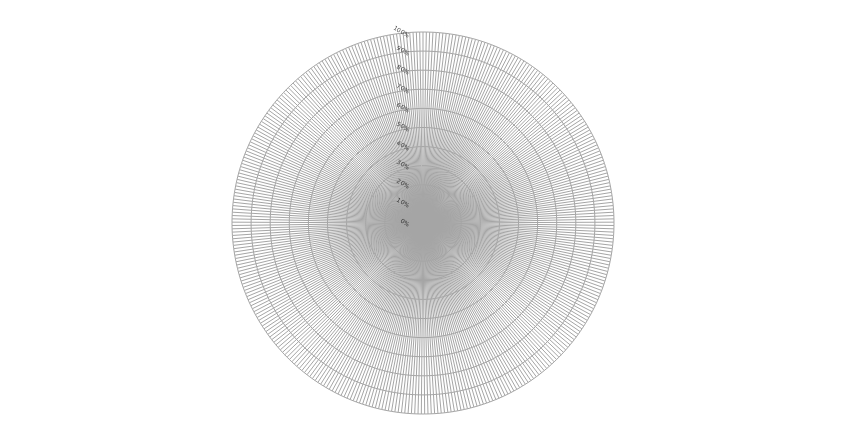
| Category | Kwaliteitsstandaard 1 | Kwaliteitsstandaard 2 | Kwaliteitsstandaard 3 | Kwaliteitsstandaard 4 | Kwaliteitsstandaard 5 | Kwaliteitsstandaard 6 | Kwaliteitsstandaard 7 | Kwaliteitsstandaard 8 | Kwaliteitsstandaard 9 | Kwaliteitsstandaard 10 |
|---|---|---|---|---|---|---|---|---|---|---|
| 0.0 | 0 | 0 | 0 | 0 | 0 | 0 | 0 | 0 | 0 | 0 |
| 1.0 | 0 | 0 | 0 | 0 | 0 | 0 | 0 | 0 | 0 | 0 |
| 2.0 | 0 | 0 | 0 | 0 | 0 | 0 | 0 | 0 | 0 | 0 |
| 3.0 | 0 | 0 | 0 | 0 | 0 | 0 | 0 | 0 | 0 | 0 |
| 4.0 | 0 | 0 | 0 | 0 | 0 | 0 | 0 | 0 | 0 | 0 |
| 5.0 | 0 | 0 | 0 | 0 | 0 | 0 | 0 | 0 | 0 | 0 |
| 6.0 | 0 | 0 | 0 | 0 | 0 | 0 | 0 | 0 | 0 | 0 |
| 7.0 | 0 | 0 | 0 | 0 | 0 | 0 | 0 | 0 | 0 | 0 |
| 8.0 | 0 | 0 | 0 | 0 | 0 | 0 | 0 | 0 | 0 | 0 |
| 9.0 | 0 | 0 | 0 | 0 | 0 | 0 | 0 | 0 | 0 | 0 |
| 10.0 | 0 | 0 | 0 | 0 | 0 | 0 | 0 | 0 | 0 | 0 |
| 11.0 | 0 | 0 | 0 | 0 | 0 | 0 | 0 | 0 | 0 | 0 |
| 12.0 | 0 | 0 | 0 | 0 | 0 | 0 | 0 | 0 | 0 | 0 |
| 13.0 | 0 | 0 | 0 | 0 | 0 | 0 | 0 | 0 | 0 | 0 |
| 14.0 | 0 | 0 | 0 | 0 | 0 | 0 | 0 | 0 | 0 | 0 |
| 15.0 | 0 | 0 | 0 | 0 | 0 | 0 | 0 | 0 | 0 | 0 |
| 16.0 | 0 | 0 | 0 | 0 | 0 | 0 | 0 | 0 | 0 | 0 |
| 17.0 | 0 | 0 | 0 | 0 | 0 | 0 | 0 | 0 | 0 | 0 |
| 18.0 | 0 | 0 | 0 | 0 | 0 | 0 | 0 | 0 | 0 | 0 |
| 19.0 | 0 | 0 | 0 | 0 | 0 | 0 | 0 | 0 | 0 | 0 |
| 20.0 | 0 | 0 | 0 | 0 | 0 | 0 | 0 | 0 | 0 | 0 |
| 21.0 | 0 | 0 | 0 | 0 | 0 | 0 | 0 | 0 | 0 | 0 |
| 22.0 | 0 | 0 | 0 | 0 | 0 | 0 | 0 | 0 | 0 | 0 |
| 23.0 | 0 | 0 | 0 | 0 | 0 | 0 | 0 | 0 | 0 | 0 |
| 24.0 | 0 | 0 | 0 | 0 | 0 | 0 | 0 | 0 | 0 | 0 |
| 25.0 | 0 | 0 | 0 | 0 | 0 | 0 | 0 | 0 | 0 | 0 |
| 26.0 | 0 | 0 | 0 | 0 | 0 | 0 | 0 | 0 | 0 | 0 |
| 27.0 | 0 | 0 | 0 | 0 | 0 | 0 | 0 | 0 | 0 | 0 |
| 28.0 | 0 | 0 | 0 | 0 | 0 | 0 | 0 | 0 | 0 | 0 |
| 29.0 | 0 | 0 | 0 | 0 | 0 | 0 | 0 | 0 | 0 | 0 |
| 30.0 | 0 | 0 | 0 | 0 | 0 | 0 | 0 | 0 | 0 | 0 |
| 31.0 | 0 | 0 | 0 | 0 | 0 | 0 | 0 | 0 | 0 | 0 |
| 32.0 | 0 | 0 | 0 | 0 | 0 | 0 | 0 | 0 | 0 | 0 |
| 33.0 | 0 | 0 | 0 | 0 | 0 | 0 | 0 | 0 | 0 | 0 |
| 34.0 | 0 | 0 | 0 | 0 | 0 | 0 | 0 | 0 | 0 | 0 |
| 35.0 | 0 | 0 | 0 | 0 | 0 | 0 | 0 | 0 | 0 | 0 |
| 36.0 | 0 | 0 | 0 | 0 | 0 | 0 | 0 | 0 | 0 | 0 |
| 37.0 | 0 | 0 | 0 | 0 | 0 | 0 | 0 | 0 | 0 | 0 |
| 38.0 | 0 | 0 | 0 | 0 | 0 | 0 | 0 | 0 | 0 | 0 |
| 39.0 | 0 | 0 | 0 | 0 | 0 | 0 | 0 | 0 | 0 | 0 |
| 40.0 | 0 | 0 | 0 | 0 | 0 | 0 | 0 | 0 | 0 | 0 |
| 41.0 | 0 | 0 | 0 | 0 | 0 | 0 | 0 | 0 | 0 | 0 |
| 42.0 | 0 | 0 | 0 | 0 | 0 | 0 | 0 | 0 | 0 | 0 |
| 43.0 | 0 | 0 | 0 | 0 | 0 | 0 | 0 | 0 | 0 | 0 |
| 44.0 | 0 | 0 | 0 | 0 | 0 | 0 | 0 | 0 | 0 | 0 |
| 45.0 | 0 | 0 | 0 | 0 | 0 | 0 | 0 | 0 | 0 | 0 |
| 46.0 | 0 | 0 | 0 | 0 | 0 | 0 | 0 | 0 | 0 | 0 |
| 47.0 | 0 | 0 | 0 | 0 | 0 | 0 | 0 | 0 | 0 | 0 |
| 48.0 | 0 | 0 | 0 | 0 | 0 | 0 | 0 | 0 | 0 | 0 |
| 49.0 | 0 | 0 | 0 | 0 | 0 | 0 | 0 | 0 | 0 | 0 |
| 50.0 | 0 | 0 | 0 | 0 | 0 | 0 | 0 | 0 | 0 | 0 |
| 51.0 | 0 | 0 | 0 | 0 | 0 | 0 | 0 | 0 | 0 | 0 |
| 52.0 | 0 | 0 | 0 | 0 | 0 | 0 | 0 | 0 | 0 | 0 |
| 53.0 | 0 | 0 | 0 | 0 | 0 | 0 | 0 | 0 | 0 | 0 |
| 54.0 | 0 | 0 | 0 | 0 | 0 | 0 | 0 | 0 | 0 | 0 |
| 55.0 | 0 | 0 | 0 | 0 | 0 | 0 | 0 | 0 | 0 | 0 |
| 56.0 | 0 | 0 | 0 | 0 | 0 | 0 | 0 | 0 | 0 | 0 |
| 57.0 | 0 | 0 | 0 | 0 | 0 | 0 | 0 | 0 | 0 | 0 |
| 58.0 | 0 | 0 | 0 | 0 | 0 | 0 | 0 | 0 | 0 | 0 |
| 59.0 | 0 | 0 | 0 | 0 | 0 | 0 | 0 | 0 | 0 | 0 |
| 60.0 | 0 | 0 | 0 | 0 | 0 | 0 | 0 | 0 | 0 | 0 |
| 61.0 | 0 | 0 | 0 | 0 | 0 | 0 | 0 | 0 | 0 | 0 |
| 62.0 | 0 | 0 | 0 | 0 | 0 | 0 | 0 | 0 | 0 | 0 |
| 63.0 | 0 | 0 | 0 | 0 | 0 | 0 | 0 | 0 | 0 | 0 |
| 64.0 | 0 | 0 | 0 | 0 | 0 | 0 | 0 | 0 | 0 | 0 |
| 65.0 | 0 | 0 | 0 | 0 | 0 | 0 | 0 | 0 | 0 | 0 |
| 66.0 | 0 | 0 | 0 | 0 | 0 | 0 | 0 | 0 | 0 | 0 |
| 67.0 | 0 | 0 | 0 | 0 | 0 | 0 | 0 | 0 | 0 | 0 |
| 68.0 | 0 | 0 | 0 | 0 | 0 | 0 | 0 | 0 | 0 | 0 |
| 69.0 | 0 | 0 | 0 | 0 | 0 | 0 | 0 | 0 | 0 | 0 |
| 70.0 | 0 | 0 | 0 | 0 | 0 | 0 | 0 | 0 | 0 | 0 |
| 71.0 | 0 | 0 | 0 | 0 | 0 | 0 | 0 | 0 | 0 | 0 |
| 72.0 | 0 | 0 | 0 | 0 | 0 | 0 | 0 | 0 | 0 | 0 |
| 73.0 | 0 | 0 | 0 | 0 | 0 | 0 | 0 | 0 | 0 | 0 |
| 74.0 | 0 | 0 | 0 | 0 | 0 | 0 | 0 | 0 | 0 | 0 |
| 75.0 | 0 | 0 | 0 | 0 | 0 | 0 | 0 | 0 | 0 | 0 |
| 76.0 | 0 | 0 | 0 | 0 | 0 | 0 | 0 | 0 | 0 | 0 |
| 77.0 | 0 | 0 | 0 | 0 | 0 | 0 | 0 | 0 | 0 | 0 |
| 78.0 | 0 | 0 | 0 | 0 | 0 | 0 | 0 | 0 | 0 | 0 |
| 79.0 | 0 | 0 | 0 | 0 | 0 | 0 | 0 | 0 | 0 | 0 |
| 80.0 | 0 | 0 | 0 | 0 | 0 | 0 | 0 | 0 | 0 | 0 |
| 81.0 | 0 | 0 | 0 | 0 | 0 | 0 | 0 | 0 | 0 | 0 |
| 82.0 | 0 | 0 | 0 | 0 | 0 | 0 | 0 | 0 | 0 | 0 |
| 83.0 | 0 | 0 | 0 | 0 | 0 | 0 | 0 | 0 | 0 | 0 |
| 84.0 | 0 | 0 | 0 | 0 | 0 | 0 | 0 | 0 | 0 | 0 |
| 85.0 | 0 | 0 | 0 | 0 | 0 | 0 | 0 | 0 | 0 | 0 |
| 86.0 | 0 | 0 | 0 | 0 | 0 | 0 | 0 | 0 | 0 | 0 |
| 87.0 | 0 | 0 | 0 | 0 | 0 | 0 | 0 | 0 | 0 | 0 |
| 88.0 | 0 | 0 | 0 | 0 | 0 | 0 | 0 | 0 | 0 | 0 |
| 89.0 | 0 | 0 | 0 | 0 | 0 | 0 | 0 | 0 | 0 | 0 |
| 90.0 | 0 | 0 | 0 | 0 | 0 | 0 | 0 | 0 | 0 | 0 |
| 91.0 | 0 | 0 | 0 | 0 | 0 | 0 | 0 | 0 | 0 | 0 |
| 92.0 | 0 | 0 | 0 | 0 | 0 | 0 | 0 | 0 | 0 | 0 |
| 93.0 | 0 | 0 | 0 | 0 | 0 | 0 | 0 | 0 | 0 | 0 |
| 94.0 | 0 | 0 | 0 | 0 | 0 | 0 | 0 | 0 | 0 | 0 |
| 95.0 | 0 | 0 | 0 | 0 | 0 | 0 | 0 | 0 | 0 | 0 |
| 96.0 | 0 | 0 | 0 | 0 | 0 | 0 | 0 | 0 | 0 | 0 |
| 97.0 | 0 | 0 | 0 | 0 | 0 | 0 | 0 | 0 | 0 | 0 |
| 98.0 | 0 | 0 | 0 | 0 | 0 | 0 | 0 | 0 | 0 | 0 |
| 99.0 | 0 | 0 | 0 | 0 | 0 | 0 | 0 | 0 | 0 | 0 |
| 100.0 | 0 | 0 | 0 | 0 | 0 | 0 | 0 | 0 | 0 | 0 |
| 101.0 | 0 | 0 | 0 | 0 | 0 | 0 | 0 | 0 | 0 | 0 |
| 102.0 | 0 | 0 | 0 | 0 | 0 | 0 | 0 | 0 | 0 | 0 |
| 103.0 | 0 | 0 | 0 | 0 | 0 | 0 | 0 | 0 | 0 | 0 |
| 104.0 | 0 | 0 | 0 | 0 | 0 | 0 | 0 | 0 | 0 | 0 |
| 105.0 | 0 | 0 | 0 | 0 | 0 | 0 | 0 | 0 | 0 | 0 |
| 106.0 | 0 | 0 | 0 | 0 | 0 | 0 | 0 | 0 | 0 | 0 |
| 107.0 | 0 | 0 | 0 | 0 | 0 | 0 | 0 | 0 | 0 | 0 |
| 108.0 | 0 | 0 | 0 | 0 | 0 | 0 | 0 | 0 | 0 | 0 |
| 109.0 | 0 | 0 | 0 | 0 | 0 | 0 | 0 | 0 | 0 | 0 |
| 110.0 | 0 | 0 | 0 | 0 | 0 | 0 | 0 | 0 | 0 | 0 |
| 111.0 | 0 | 0 | 0 | 0 | 0 | 0 | 0 | 0 | 0 | 0 |
| 112.0 | 0 | 0 | 0 | 0 | 0 | 0 | 0 | 0 | 0 | 0 |
| 113.0 | 0 | 0 | 0 | 0 | 0 | 0 | 0 | 0 | 0 | 0 |
| 114.0 | 0 | 0 | 0 | 0 | 0 | 0 | 0 | 0 | 0 | 0 |
| 115.0 | 0 | 0 | 0 | 0 | 0 | 0 | 0 | 0 | 0 | 0 |
| 116.0 | 0 | 0 | 0 | 0 | 0 | 0 | 0 | 0 | 0 | 0 |
| 117.0 | 0 | 0 | 0 | 0 | 0 | 0 | 0 | 0 | 0 | 0 |
| 118.0 | 0 | 0 | 0 | 0 | 0 | 0 | 0 | 0 | 0 | 0 |
| 119.0 | 0 | 0 | 0 | 0 | 0 | 0 | 0 | 0 | 0 | 0 |
| 120.0 | 0 | 0 | 0 | 0 | 0 | 0 | 0 | 0 | 0 | 0 |
| 121.0 | 0 | 0 | 0 | 0 | 0 | 0 | 0 | 0 | 0 | 0 |
| 122.0 | 0 | 0 | 0 | 0 | 0 | 0 | 0 | 0 | 0 | 0 |
| 123.0 | 0 | 0 | 0 | 0 | 0 | 0 | 0 | 0 | 0 | 0 |
| 124.0 | 0 | 0 | 0 | 0 | 0 | 0 | 0 | 0 | 0 | 0 |
| 125.0 | 0 | 0 | 0 | 0 | 0 | 0 | 0 | 0 | 0 | 0 |
| 126.0 | 0 | 0 | 0 | 0 | 0 | 0 | 0 | 0 | 0 | 0 |
| 127.0 | 0 | 0 | 0 | 0 | 0 | 0 | 0 | 0 | 0 | 0 |
| 128.0 | 0 | 0 | 0 | 0 | 0 | 0 | 0 | 0 | 0 | 0 |
| 129.0 | 0 | 0 | 0 | 0 | 0 | 0 | 0 | 0 | 0 | 0 |
| 130.0 | 0 | 0 | 0 | 0 | 0 | 0 | 0 | 0 | 0 | 0 |
| 131.0 | 0 | 0 | 0 | 0 | 0 | 0 | 0 | 0 | 0 | 0 |
| 132.0 | 0 | 0 | 0 | 0 | 0 | 0 | 0 | 0 | 0 | 0 |
| 133.0 | 0 | 0 | 0 | 0 | 0 | 0 | 0 | 0 | 0 | 0 |
| 134.0 | 0 | 0 | 0 | 0 | 0 | 0 | 0 | 0 | 0 | 0 |
| 135.0 | 0 | 0 | 0 | 0 | 0 | 0 | 0 | 0 | 0 | 0 |
| 136.0 | 0 | 0 | 0 | 0 | 0 | 0 | 0 | 0 | 0 | 0 |
| 137.0 | 0 | 0 | 0 | 0 | 0 | 0 | 0 | 0 | 0 | 0 |
| 138.0 | 0 | 0 | 0 | 0 | 0 | 0 | 0 | 0 | 0 | 0 |
| 139.0 | 0 | 0 | 0 | 0 | 0 | 0 | 0 | 0 | 0 | 0 |
| 140.0 | 0 | 0 | 0 | 0 | 0 | 0 | 0 | 0 | 0 | 0 |
| 141.0 | 0 | 0 | 0 | 0 | 0 | 0 | 0 | 0 | 0 | 0 |
| 142.0 | 0 | 0 | 0 | 0 | 0 | 0 | 0 | 0 | 0 | 0 |
| 143.0 | 0 | 0 | 0 | 0 | 0 | 0 | 0 | 0 | 0 | 0 |
| 144.0 | 0 | 0 | 0 | 0 | 0 | 0 | 0 | 0 | 0 | 0 |
| 145.0 | 0 | 0 | 0 | 0 | 0 | 0 | 0 | 0 | 0 | 0 |
| 146.0 | 0 | 0 | 0 | 0 | 0 | 0 | 0 | 0 | 0 | 0 |
| 147.0 | 0 | 0 | 0 | 0 | 0 | 0 | 0 | 0 | 0 | 0 |
| 148.0 | 0 | 0 | 0 | 0 | 0 | 0 | 0 | 0 | 0 | 0 |
| 149.0 | 0 | 0 | 0 | 0 | 0 | 0 | 0 | 0 | 0 | 0 |
| 150.0 | 0 | 0 | 0 | 0 | 0 | 0 | 0 | 0 | 0 | 0 |
| 151.0 | 0 | 0 | 0 | 0 | 0 | 0 | 0 | 0 | 0 | 0 |
| 152.0 | 0 | 0 | 0 | 0 | 0 | 0 | 0 | 0 | 0 | 0 |
| 153.0 | 0 | 0 | 0 | 0 | 0 | 0 | 0 | 0 | 0 | 0 |
| 154.0 | 0 | 0 | 0 | 0 | 0 | 0 | 0 | 0 | 0 | 0 |
| 155.0 | 0 | 0 | 0 | 0 | 0 | 0 | 0 | 0 | 0 | 0 |
| 156.0 | 0 | 0 | 0 | 0 | 0 | 0 | 0 | 0 | 0 | 0 |
| 157.0 | 0 | 0 | 0 | 0 | 0 | 0 | 0 | 0 | 0 | 0 |
| 158.0 | 0 | 0 | 0 | 0 | 0 | 0 | 0 | 0 | 0 | 0 |
| 159.0 | 0 | 0 | 0 | 0 | 0 | 0 | 0 | 0 | 0 | 0 |
| 160.0 | 0 | 0 | 0 | 0 | 0 | 0 | 0 | 0 | 0 | 0 |
| 161.0 | 0 | 0 | 0 | 0 | 0 | 0 | 0 | 0 | 0 | 0 |
| 162.0 | 0 | 0 | 0 | 0 | 0 | 0 | 0 | 0 | 0 | 0 |
| 163.0 | 0 | 0 | 0 | 0 | 0 | 0 | 0 | 0 | 0 | 0 |
| 164.0 | 0 | 0 | 0 | 0 | 0 | 0 | 0 | 0 | 0 | 0 |
| 165.0 | 0 | 0 | 0 | 0 | 0 | 0 | 0 | 0 | 0 | 0 |
| 166.0 | 0 | 0 | 0 | 0 | 0 | 0 | 0 | 0 | 0 | 0 |
| 167.0 | 0 | 0 | 0 | 0 | 0 | 0 | 0 | 0 | 0 | 0 |
| 168.0 | 0 | 0 | 0 | 0 | 0 | 0 | 0 | 0 | 0 | 0 |
| 169.0 | 0 | 0 | 0 | 0 | 0 | 0 | 0 | 0 | 0 | 0 |
| 170.0 | 0 | 0 | 0 | 0 | 0 | 0 | 0 | 0 | 0 | 0 |
| 171.0 | 0 | 0 | 0 | 0 | 0 | 0 | 0 | 0 | 0 | 0 |
| 172.0 | 0 | 0 | 0 | 0 | 0 | 0 | 0 | 0 | 0 | 0 |
| 173.0 | 0 | 0 | 0 | 0 | 0 | 0 | 0 | 0 | 0 | 0 |
| 174.0 | 0 | 0 | 0 | 0 | 0 | 0 | 0 | 0 | 0 | 0 |
| 175.0 | 0 | 0 | 0 | 0 | 0 | 0 | 0 | 0 | 0 | 0 |
| 176.0 | 0 | 0 | 0 | 0 | 0 | 0 | 0 | 0 | 0 | 0 |
| 177.0 | 0 | 0 | 0 | 0 | 0 | 0 | 0 | 0 | 0 | 0 |
| 178.0 | 0 | 0 | 0 | 0 | 0 | 0 | 0 | 0 | 0 | 0 |
| 179.0 | 0 | 0 | 0 | 0 | 0 | 0 | 0 | 0 | 0 | 0 |
| 180.0 | 0 | 0 | 0 | 0 | 0 | 0 | 0 | 0 | 0 | 0 |
| 181.0 | 0 | 0 | 0 | 0 | 0 | 0 | 0 | 0 | 0 | 0 |
| 182.0 | 0 | 0 | 0 | 0 | 0 | 0 | 0 | 0 | 0 | 0 |
| 183.0 | 0 | 0 | 0 | 0 | 0 | 0 | 0 | 0 | 0 | 0 |
| 184.0 | 0 | 0 | 0 | 0 | 0 | 0 | 0 | 0 | 0 | 0 |
| 185.0 | 0 | 0 | 0 | 0 | 0 | 0 | 0 | 0 | 0 | 0 |
| 186.0 | 0 | 0 | 0 | 0 | 0 | 0 | 0 | 0 | 0 | 0 |
| 187.0 | 0 | 0 | 0 | 0 | 0 | 0 | 0 | 0 | 0 | 0 |
| 188.0 | 0 | 0 | 0 | 0 | 0 | 0 | 0 | 0 | 0 | 0 |
| 189.0 | 0 | 0 | 0 | 0 | 0 | 0 | 0 | 0 | 0 | 0 |
| 190.0 | 0 | 0 | 0 | 0 | 0 | 0 | 0 | 0 | 0 | 0 |
| 191.0 | 0 | 0 | 0 | 0 | 0 | 0 | 0 | 0 | 0 | 0 |
| 192.0 | 0 | 0 | 0 | 0 | 0 | 0 | 0 | 0 | 0 | 0 |
| 193.0 | 0 | 0 | 0 | 0 | 0 | 0 | 0 | 0 | 0 | 0 |
| 194.0 | 0 | 0 | 0 | 0 | 0 | 0 | 0 | 0 | 0 | 0 |
| 195.0 | 0 | 0 | 0 | 0 | 0 | 0 | 0 | 0 | 0 | 0 |
| 196.0 | 0 | 0 | 0 | 0 | 0 | 0 | 0 | 0 | 0 | 0 |
| 197.0 | 0 | 0 | 0 | 0 | 0 | 0 | 0 | 0 | 0 | 0 |
| 198.0 | 0 | 0 | 0 | 0 | 0 | 0 | 0 | 0 | 0 | 0 |
| 199.0 | 0 | 0 | 0 | 0 | 0 | 0 | 0 | 0 | 0 | 0 |
| 200.0 | 0 | 0 | 0 | 0 | 0 | 0 | 0 | 0 | 0 | 0 |
| 201.0 | 0 | 0 | 0 | 0 | 0 | 0 | 0 | 0 | 0 | 0 |
| 202.0 | 0 | 0 | 0 | 0 | 0 | 0 | 0 | 0 | 0 | 0 |
| 203.0 | 0 | 0 | 0 | 0 | 0 | 0 | 0 | 0 | 0 | 0 |
| 204.0 | 0 | 0 | 0 | 0 | 0 | 0 | 0 | 0 | 0 | 0 |
| 205.0 | 0 | 0 | 0 | 0 | 0 | 0 | 0 | 0 | 0 | 0 |
| 206.0 | 0 | 0 | 0 | 0 | 0 | 0 | 0 | 0 | 0 | 0 |
| 207.0 | 0 | 0 | 0 | 0 | 0 | 0 | 0 | 0 | 0 | 0 |
| 208.0 | 0 | 0 | 0 | 0 | 0 | 0 | 0 | 0 | 0 | 0 |
| 209.0 | 0 | 0 | 0 | 0 | 0 | 0 | 0 | 0 | 0 | 0 |
| 210.0 | 0 | 0 | 0 | 0 | 0 | 0 | 0 | 0 | 0 | 0 |
| 211.0 | 0 | 0 | 0 | 0 | 0 | 0 | 0 | 0 | 0 | 0 |
| 212.0 | 0 | 0 | 0 | 0 | 0 | 0 | 0 | 0 | 0 | 0 |
| 213.0 | 0 | 0 | 0 | 0 | 0 | 0 | 0 | 0 | 0 | 0 |
| 214.0 | 0 | 0 | 0 | 0 | 0 | 0 | 0 | 0 | 0 | 0 |
| 215.0 | 0 | 0 | 0 | 0 | 0 | 0 | 0 | 0 | 0 | 0 |
| 216.0 | 0 | 0 | 0 | 0 | 0 | 0 | 0 | 0 | 0 | 0 |
| 217.0 | 0 | 0 | 0 | 0 | 0 | 0 | 0 | 0 | 0 | 0 |
| 218.0 | 0 | 0 | 0 | 0 | 0 | 0 | 0 | 0 | 0 | 0 |
| 219.0 | 0 | 0 | 0 | 0 | 0 | 0 | 0 | 0 | 0 | 0 |
| 220.0 | 0 | 0 | 0 | 0 | 0 | 0 | 0 | 0 | 0 | 0 |
| 221.0 | 0 | 0 | 0 | 0 | 0 | 0 | 0 | 0 | 0 | 0 |
| 222.0 | 0 | 0 | 0 | 0 | 0 | 0 | 0 | 0 | 0 | 0 |
| 223.0 | 0 | 0 | 0 | 0 | 0 | 0 | 0 | 0 | 0 | 0 |
| 224.0 | 0 | 0 | 0 | 0 | 0 | 0 | 0 | 0 | 0 | 0 |
| 225.0 | 0 | 0 | 0 | 0 | 0 | 0 | 0 | 0 | 0 | 0 |
| 226.0 | 0 | 0 | 0 | 0 | 0 | 0 | 0 | 0 | 0 | 0 |
| 227.0 | 0 | 0 | 0 | 0 | 0 | 0 | 0 | 0 | 0 | 0 |
| 228.0 | 0 | 0 | 0 | 0 | 0 | 0 | 0 | 0 | 0 | 0 |
| 229.0 | 0 | 0 | 0 | 0 | 0 | 0 | 0 | 0 | 0 | 0 |
| 230.0 | 0 | 0 | 0 | 0 | 0 | 0 | 0 | 0 | 0 | 0 |
| 231.0 | 0 | 0 | 0 | 0 | 0 | 0 | 0 | 0 | 0 | 0 |
| 232.0 | 0 | 0 | 0 | 0 | 0 | 0 | 0 | 0 | 0 | 0 |
| 233.0 | 0 | 0 | 0 | 0 | 0 | 0 | 0 | 0 | 0 | 0 |
| 234.0 | 0 | 0 | 0 | 0 | 0 | 0 | 0 | 0 | 0 | 0 |
| 235.0 | 0 | 0 | 0 | 0 | 0 | 0 | 0 | 0 | 0 | 0 |
| 236.0 | 0 | 0 | 0 | 0 | 0 | 0 | 0 | 0 | 0 | 0 |
| 237.0 | 0 | 0 | 0 | 0 | 0 | 0 | 0 | 0 | 0 | 0 |
| 238.0 | 0 | 0 | 0 | 0 | 0 | 0 | 0 | 0 | 0 | 0 |
| 239.0 | 0 | 0 | 0 | 0 | 0 | 0 | 0 | 0 | 0 | 0 |
| 240.0 | 0 | 0 | 0 | 0 | 0 | 0 | 0 | 0 | 0 | 0 |
| 241.0 | 0 | 0 | 0 | 0 | 0 | 0 | 0 | 0 | 0 | 0 |
| 242.0 | 0 | 0 | 0 | 0 | 0 | 0 | 0 | 0 | 0 | 0 |
| 243.0 | 0 | 0 | 0 | 0 | 0 | 0 | 0 | 0 | 0 | 0 |
| 244.0 | 0 | 0 | 0 | 0 | 0 | 0 | 0 | 0 | 0 | 0 |
| 245.0 | 0 | 0 | 0 | 0 | 0 | 0 | 0 | 0 | 0 | 0 |
| 246.0 | 0 | 0 | 0 | 0 | 0 | 0 | 0 | 0 | 0 | 0 |
| 247.0 | 0 | 0 | 0 | 0 | 0 | 0 | 0 | 0 | 0 | 0 |
| 248.0 | 0 | 0 | 0 | 0 | 0 | 0 | 0 | 0 | 0 | 0 |
| 249.0 | 0 | 0 | 0 | 0 | 0 | 0 | 0 | 0 | 0 | 0 |
| 250.0 | 0 | 0 | 0 | 0 | 0 | 0 | 0 | 0 | 0 | 0 |
| 251.0 | 0 | 0 | 0 | 0 | 0 | 0 | 0 | 0 | 0 | 0 |
| 252.0 | 0 | 0 | 0 | 0 | 0 | 0 | 0 | 0 | 0 | 0 |
| 253.0 | 0 | 0 | 0 | 0 | 0 | 0 | 0 | 0 | 0 | 0 |
| 254.0 | 0 | 0 | 0 | 0 | 0 | 0 | 0 | 0 | 0 | 0 |
| 255.0 | 0 | 0 | 0 | 0 | 0 | 0 | 0 | 0 | 0 | 0 |
| 256.0 | 0 | 0 | 0 | 0 | 0 | 0 | 0 | 0 | 0 | 0 |
| 257.0 | 0 | 0 | 0 | 0 | 0 | 0 | 0 | 0 | 0 | 0 |
| 258.0 | 0 | 0 | 0 | 0 | 0 | 0 | 0 | 0 | 0 | 0 |
| 259.0 | 0 | 0 | 0 | 0 | 0 | 0 | 0 | 0 | 0 | 0 |
| 260.0 | 0 | 0 | 0 | 0 | 0 | 0 | 0 | 0 | 0 | 0 |
| 261.0 | 0 | 0 | 0 | 0 | 0 | 0 | 0 | 0 | 0 | 0 |
| 262.0 | 0 | 0 | 0 | 0 | 0 | 0 | 0 | 0 | 0 | 0 |
| 263.0 | 0 | 0 | 0 | 0 | 0 | 0 | 0 | 0 | 0 | 0 |
| 264.0 | 0 | 0 | 0 | 0 | 0 | 0 | 0 | 0 | 0 | 0 |
| 265.0 | 0 | 0 | 0 | 0 | 0 | 0 | 0 | 0 | 0 | 0 |
| 266.0 | 0 | 0 | 0 | 0 | 0 | 0 | 0 | 0 | 0 | 0 |
| 267.0 | 0 | 0 | 0 | 0 | 0 | 0 | 0 | 0 | 0 | 0 |
| 268.0 | 0 | 0 | 0 | 0 | 0 | 0 | 0 | 0 | 0 | 0 |
| 269.0 | 0 | 0 | 0 | 0 | 0 | 0 | 0 | 0 | 0 | 0 |
| 270.0 | 0 | 0 | 0 | 0 | 0 | 0 | 0 | 0 | 0 | 0 |
| 271.0 | 0 | 0 | 0 | 0 | 0 | 0 | 0 | 0 | 0 | 0 |
| 272.0 | 0 | 0 | 0 | 0 | 0 | 0 | 0 | 0 | 0 | 0 |
| 273.0 | 0 | 0 | 0 | 0 | 0 | 0 | 0 | 0 | 0 | 0 |
| 274.0 | 0 | 0 | 0 | 0 | 0 | 0 | 0 | 0 | 0 | 0 |
| 275.0 | 0 | 0 | 0 | 0 | 0 | 0 | 0 | 0 | 0 | 0 |
| 276.0 | 0 | 0 | 0 | 0 | 0 | 0 | 0 | 0 | 0 | 0 |
| 277.0 | 0 | 0 | 0 | 0 | 0 | 0 | 0 | 0 | 0 | 0 |
| 278.0 | 0 | 0 | 0 | 0 | 0 | 0 | 0 | 0 | 0 | 0 |
| 279.0 | 0 | 0 | 0 | 0 | 0 | 0 | 0 | 0 | 0 | 0 |
| 280.0 | 0 | 0 | 0 | 0 | 0 | 0 | 0 | 0 | 0 | 0 |
| 281.0 | 0 | 0 | 0 | 0 | 0 | 0 | 0 | 0 | 0 | 0 |
| 282.0 | 0 | 0 | 0 | 0 | 0 | 0 | 0 | 0 | 0 | 0 |
| 283.0 | 0 | 0 | 0 | 0 | 0 | 0 | 0 | 0 | 0 | 0 |
| 284.0 | 0 | 0 | 0 | 0 | 0 | 0 | 0 | 0 | 0 | 0 |
| 285.0 | 0 | 0 | 0 | 0 | 0 | 0 | 0 | 0 | 0 | 0 |
| 286.0 | 0 | 0 | 0 | 0 | 0 | 0 | 0 | 0 | 0 | 0 |
| 287.0 | 0 | 0 | 0 | 0 | 0 | 0 | 0 | 0 | 0 | 0 |
| 288.0 | 0 | 0 | 0 | 0 | 0 | 0 | 0 | 0 | 0 | 0 |
| 289.0 | 0 | 0 | 0 | 0 | 0 | 0 | 0 | 0 | 0 | 0 |
| 290.0 | 0 | 0 | 0 | 0 | 0 | 0 | 0 | 0 | 0 | 0 |
| 291.0 | 0 | 0 | 0 | 0 | 0 | 0 | 0 | 0 | 0 | 0 |
| 292.0 | 0 | 0 | 0 | 0 | 0 | 0 | 0 | 0 | 0 | 0 |
| 293.0 | 0 | 0 | 0 | 0 | 0 | 0 | 0 | 0 | 0 | 0 |
| 294.0 | 0 | 0 | 0 | 0 | 0 | 0 | 0 | 0 | 0 | 0 |
| 295.0 | 0 | 0 | 0 | 0 | 0 | 0 | 0 | 0 | 0 | 0 |
| 296.0 | 0 | 0 | 0 | 0 | 0 | 0 | 0 | 0 | 0 | 0 |
| 297.0 | 0 | 0 | 0 | 0 | 0 | 0 | 0 | 0 | 0 | 0 |
| 298.0 | 0 | 0 | 0 | 0 | 0 | 0 | 0 | 0 | 0 | 0 |
| 299.0 | 0 | 0 | 0 | 0 | 0 | 0 | 0 | 0 | 0 | 0 |
| 300.0 | 0 | 0 | 0 | 0 | 0 | 0 | 0 | 0 | 0 | 0 |
| 301.0 | 0 | 0 | 0 | 0 | 0 | 0 | 0 | 0 | 0 | 0 |
| 302.0 | 0 | 0 | 0 | 0 | 0 | 0 | 0 | 0 | 0 | 0 |
| 303.0 | 0 | 0 | 0 | 0 | 0 | 0 | 0 | 0 | 0 | 0 |
| 304.0 | 0 | 0 | 0 | 0 | 0 | 0 | 0 | 0 | 0 | 0 |
| 305.0 | 0 | 0 | 0 | 0 | 0 | 0 | 0 | 0 | 0 | 0 |
| 306.0 | 0 | 0 | 0 | 0 | 0 | 0 | 0 | 0 | 0 | 0 |
| 307.0 | 0 | 0 | 0 | 0 | 0 | 0 | 0 | 0 | 0 | 0 |
| 308.0 | 0 | 0 | 0 | 0 | 0 | 0 | 0 | 0 | 0 | 0 |
| 309.0 | 0 | 0 | 0 | 0 | 0 | 0 | 0 | 0 | 0 | 0 |
| 310.0 | 0 | 0 | 0 | 0 | 0 | 0 | 0 | 0 | 0 | 0 |
| 311.0 | 0 | 0 | 0 | 0 | 0 | 0 | 0 | 0 | 0 | 0 |
| 312.0 | 0 | 0 | 0 | 0 | 0 | 0 | 0 | 0 | 0 | 0 |
| 313.0 | 0 | 0 | 0 | 0 | 0 | 0 | 0 | 0 | 0 | 0 |
| 314.0 | 0 | 0 | 0 | 0 | 0 | 0 | 0 | 0 | 0 | 0 |
| 315.0 | 0 | 0 | 0 | 0 | 0 | 0 | 0 | 0 | 0 | 0 |
| 316.0 | 0 | 0 | 0 | 0 | 0 | 0 | 0 | 0 | 0 | 0 |
| 317.0 | 0 | 0 | 0 | 0 | 0 | 0 | 0 | 0 | 0 | 0 |
| 318.0 | 0 | 0 | 0 | 0 | 0 | 0 | 0 | 0 | 0 | 0 |
| 319.0 | 0 | 0 | 0 | 0 | 0 | 0 | 0 | 0 | 0 | 0 |
| 320.0 | 0 | 0 | 0 | 0 | 0 | 0 | 0 | 0 | 0 | 0 |
| 321.0 | 0 | 0 | 0 | 0 | 0 | 0 | 0 | 0 | 0 | 0 |
| 322.0 | 0 | 0 | 0 | 0 | 0 | 0 | 0 | 0 | 0 | 0 |
| 323.0 | 0 | 0 | 0 | 0 | 0 | 0 | 0 | 0 | 0 | 0 |
| 324.0 | 0 | 0 | 0 | 0 | 0 | 0 | 0 | 0 | 0 | 0 |
| 325.0 | 0 | 0 | 0 | 0 | 0 | 0 | 0 | 0 | 0 | 0 |
| 326.0 | 0 | 0 | 0 | 0 | 0 | 0 | 0 | 0 | 0 | 0 |
| 327.0 | 0 | 0 | 0 | 0 | 0 | 0 | 0 | 0 | 0 | 0 |
| 328.0 | 0 | 0 | 0 | 0 | 0 | 0 | 0 | 0 | 0 | 0 |
| 329.0 | 0 | 0 | 0 | 0 | 0 | 0 | 0 | 0 | 0 | 0 |
| 330.0 | 0 | 0 | 0 | 0 | 0 | 0 | 0 | 0 | 0 | 0 |
| 331.0 | 0 | 0 | 0 | 0 | 0 | 0 | 0 | 0 | 0 | 0 |
| 332.0 | 0 | 0 | 0 | 0 | 0 | 0 | 0 | 0 | 0 | 0 |
| 333.0 | 0 | 0 | 0 | 0 | 0 | 0 | 0 | 0 | 0 | 0 |
| 334.0 | 0 | 0 | 0 | 0 | 0 | 0 | 0 | 0 | 0 | 0 |
| 335.0 | 0 | 0 | 0 | 0 | 0 | 0 | 0 | 0 | 0 | 0 |
| 336.0 | 0 | 0 | 0 | 0 | 0 | 0 | 0 | 0 | 0 | 0 |
| 337.0 | 0 | 0 | 0 | 0 | 0 | 0 | 0 | 0 | 0 | 0 |
| 338.0 | 0 | 0 | 0 | 0 | 0 | 0 | 0 | 0 | 0 | 0 |
| 339.0 | 0 | 0 | 0 | 0 | 0 | 0 | 0 | 0 | 0 | 0 |
| 340.0 | 0 | 0 | 0 | 0 | 0 | 0 | 0 | 0 | 0 | 0 |
| 341.0 | 0 | 0 | 0 | 0 | 0 | 0 | 0 | 0 | 0 | 0 |
| 342.0 | 0 | 0 | 0 | 0 | 0 | 0 | 0 | 0 | 0 | 0 |
| 343.0 | 0 | 0 | 0 | 0 | 0 | 0 | 0 | 0 | 0 | 0 |
| 344.0 | 0 | 0 | 0 | 0 | 0 | 0 | 0 | 0 | 0 | 0 |
| 345.0 | 0 | 0 | 0 | 0 | 0 | 0 | 0 | 0 | 0 | 0 |
| 346.0 | 0 | 0 | 0 | 0 | 0 | 0 | 0 | 0 | 0 | 0 |
| 347.0 | 0 | 0 | 0 | 0 | 0 | 0 | 0 | 0 | 0 | 0 |
| 348.0 | 0 | 0 | 0 | 0 | 0 | 0 | 0 | 0 | 0 | 0 |
| 349.0 | 0 | 0 | 0 | 0 | 0 | 0 | 0 | 0 | 0 | 0 |
| 350.0 | 0 | 0 | 0 | 0 | 0 | 0 | 0 | 0 | 0 | 0 |
| 351.0 | 0 | 0 | 0 | 0 | 0 | 0 | 0 | 0 | 0 | 0 |
| 352.0 | 0 | 0 | 0 | 0 | 0 | 0 | 0 | 0 | 0 | 0 |
| 353.0 | 0 | 0 | 0 | 0 | 0 | 0 | 0 | 0 | 0 | 0 |
| 354.0 | 0 | 0 | 0 | 0 | 0 | 0 | 0 | 0 | 0 | 0 |
| 355.0 | 0 | 0 | 0 | 0 | 0 | 0 | 0 | 0 | 0 | 0 |
| 356.0 | 0 | 0 | 0 | 0 | 0 | 0 | 0 | 0 | 0 | 0 |
| 357.0 | 0 | 0 | 0 | 0 | 0 | 0 | 0 | 0 | 0 | 0 |
| 358.0 | 0 | 0 | 0 | 0 | 0 | 0 | 0 | 0 | 0 | 0 |
| 359.0 | 0 | 0 | 0 | 0 | 0 | 0 | 0 | 0 | 0 | 0 |
| 360.0 | 0 | 0 | 0 | 0 | 0 | 0 | 0 | 0 | 0 | 0 |